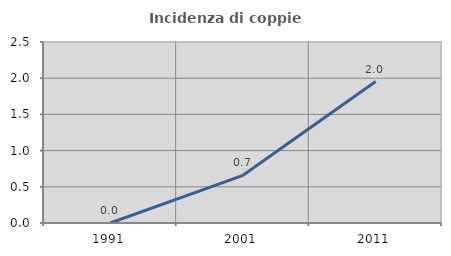
| Category | Incidenza di coppie miste |
|---|---|
| 1991.0 | 0 |
| 2001.0 | 0.659 |
| 2011.0 | 1.953 |